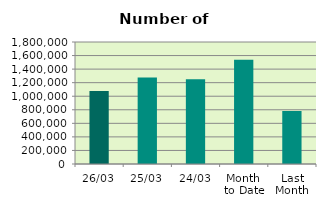
| Category | Series 0 |
|---|---|
| 26/03 | 1078298 |
| 25/03 | 1276250 |
| 24/03 | 1249320 |
| Month 
to Date | 1538206.105 |
| Last
Month | 783511.9 |